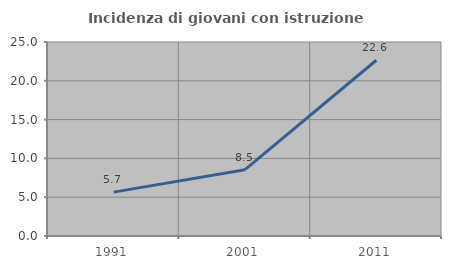
| Category | Incidenza di giovani con istruzione universitaria |
|---|---|
| 1991.0 | 5.654 |
| 2001.0 | 8.547 |
| 2011.0 | 22.646 |